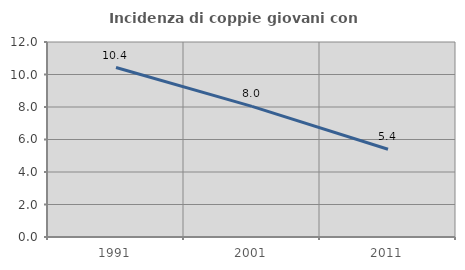
| Category | Incidenza di coppie giovani con figli |
|---|---|
| 1991.0 | 10.429 |
| 2001.0 | 8.038 |
| 2011.0 | 5.399 |